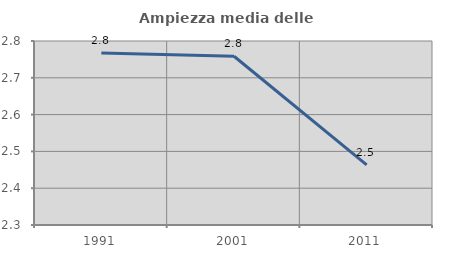
| Category | Ampiezza media delle famiglie |
|---|---|
| 1991.0 | 2.767 |
| 2001.0 | 2.759 |
| 2011.0 | 2.464 |